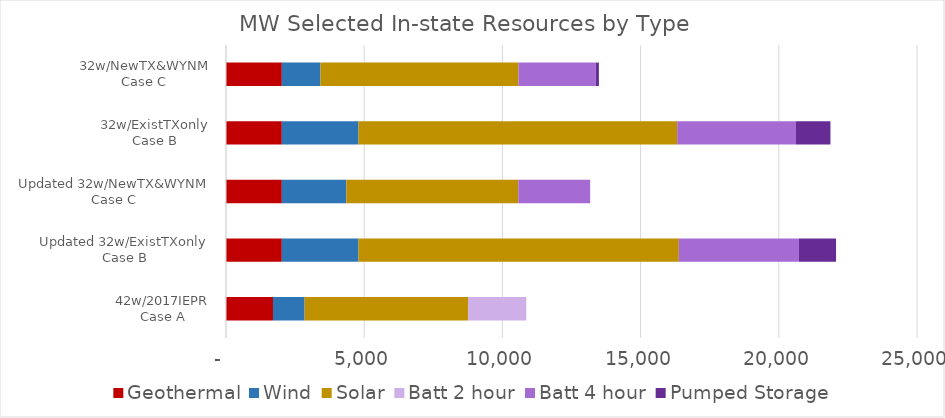
| Category | Geothermal | Wind | Solar | Batt 2 hour | Batt 4 hour | Pumped Storage |
|---|---|---|---|---|---|---|
| 42w/2017IEPR
Case A | 1699.884 | 1144.519 | 5915.907 | 2104.2 | 0 | 0 |
| Updated 32w/ExistTXonly
Case B | 2019.896 | 2774.569 | 11588.331 | 0 | 4347.08 | 1341.5 |
| Updated 32w/NewTX&WYNM
Case C | 2019.896 | 2332.536 | 6220.354 | 0 | 2602.38 | 0 |
| 32w/ExistTXonly
Case B | 2019.896 | 2774.559 | 11528.581 | 0 | 4299 | 1246.12 |
| 32w/NewTX&WYNM
Case C | 2019.896 | 1397.676 | 7162.519 | 0 | 2795.38 | 116.15 |